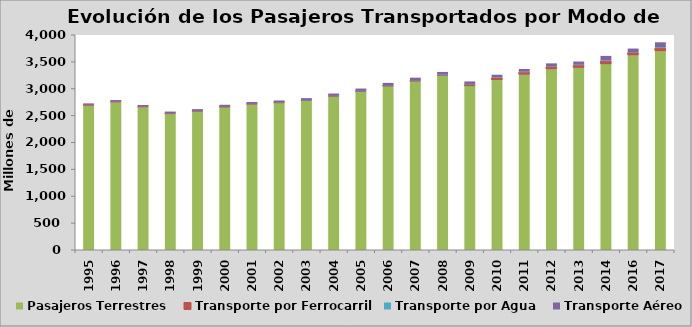
| Category | Pasajeros Terrestres | Transporte por Ferrocarril | Transporte por Agua | Transporte Aéreo |
|---|---|---|---|---|
| 1995.0 | 2691 | 6.678 | 5.098 | 25.192 |
| 1996.0 | 2750 | 6.727 | 6.394 | 26.493 |
| 1997.0 | 2658 | 5.092 | 6.228 | 28.896 |
| 1998.0 | 2536 | 1.576 | 7.179 | 30.922 |
| 1999.0 | 2580 | 0.801 | 7.854 | 32.662 |
| 2000.0 | 2660 | 0.334 | 7.4 | 33.974 |
| 2001.0 | 2713 | 0.242 | 7.507 | 33.673 |
| 2002.0 | 2740 | 0.237 | 8.715 | 33.19 |
| 2003.0 | 2780 | 0.27 | 9.843 | 35.287 |
| 2004.0 | 2860 | 0.253 | 11.744 | 39.422 |
| 2005.0 | 2950 | 0.253 | 11.461 | 42.176 |
| 2006.0 | 3050 | 0.26 | 11.985 | 46.705 |
| 2007.0 | 3141 | 0.288 | 12.761 | 52.217 |
| 2008.0 | 3238 | 8.915 | 12.597 | 53.3 |
| 2009.0 | 3050 | 28 | 10.985 | 46.971 |
| 2010.0 | 3160 | 40.398 | 11.793 | 48.698 |
| 2011.0 | 3264.3 | 41.922 | 10.814 | 50.764 |
| 2012.0 | 3363 | 43.83 | 10.268 | 55.153 |
| 2013.0 | 3391 | 45.288 | 9.969 | 60.007 |
| 2014.0 | 3459 | 55.766 | 15.272 | 81.286 |
| 2016.0 | 3623 | 47.888 | 11.948 | 65.135 |
| 2017.0 | 3701 | 56.278 | 17.413 | 89.641 |